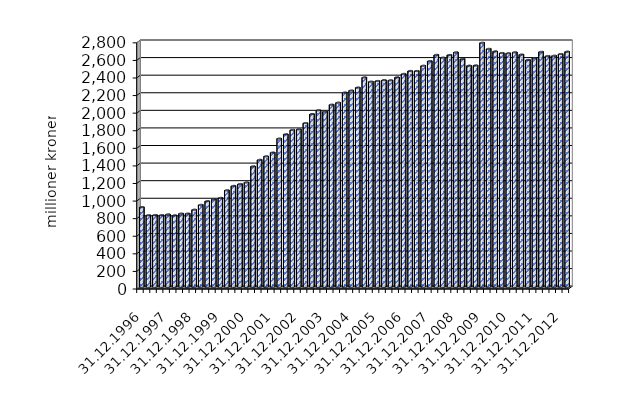
| Category | Series 0 |
|---|---|
| 31.12.1996 | 908.416 |
| 31.03.1997 | 816.888 |
| 30.06.1997 | 819.107 |
| 30.09.1997 | 817.552 |
| 31.12.1997 | 825.968 |
| 31.03.1998 | 814.897 |
| 30.06.1998 | 835.22 |
| 30.09.1998 | 835.281 |
| 31.12.1998 | 879.596 |
| 31.03.1999 | 934.62 |
| 30.06.1999 | 976.412 |
| 30.09.1999 | 997.754 |
| 31.12.1999 | 1013.598 |
| 31.03.2000 | 1100.701 |
| 30.06.2000 | 1150.3 |
| 30.09.2000 | 1172.025 |
| 31.12.2000 | 1189.651 |
| 31.03.2001 | 1372.393 |
| 30.06.2001 | 1446.885 |
| 30.09.2001 | 1486.566 |
| 31.12.2001 | 1529.197 |
| 31.03.2002 | 1688.425 |
| 30.06.2002 | 1737.205 |
| 30.09.2002 | 1786.525 |
| 31.12.2002 | 1793.289 |
| 31.03.2003 | 1864.766 |
| 30.06.2003 | 1967.535 |
| 30.09.2003 | 2010.838 |
| 31.12.2003 | 1995.419 |
| 31.03.2004 | 2074.018 |
| 30.06.2004 | 2097.095 |
| 30.09.2004 | 2212.138 |
| 31.12.2004 | 2235.082 |
| 31.03.2005 | 2268.67 |
| 30.06.2005 | 2384.125 |
| 30.09.2005 | 2335.849 |
| 31.12.2005 | 2343.776 |
| 31.03.2006 | 2353.286 |
| 30.06.2006 | 2351.281 |
| 30.09.2006 | 2384.618 |
| 31.12.2006 | 2424.277 |
| 31.03.2007 | 2457.666 |
| 30.06.2007 | 2457.37 |
| 30.09.2007 | 2517.064 |
| 31.12.2007 | 2569.962 |
| 31.03.2008 | 2640.759 |
| 30.06.2008 | 2609.016 |
| 30.09.2008 | 2639.404 |
| 31.12.2008 | 2669.518 |
| 31.03.2009 | 2594.419 |
| 30.06.2009 | 2517.3 |
| 30.09.2009 | 2520.265 |
| 31.12.2009 | 2778.162 |
| 31.03.2010 | 2708.956 |
| 30.06.2010 | 2680.032 |
| 30.09.2010 | 2661.718 |
| 31.12.2010 | 2658.994 |
| 31.03.2011 | 2670.097 |
| 30.06.2011 | 2643.777 |
| 30.09.2011 | 2582.864 |
| 31.12.2011 | 2603.653 |
| 31.03.2012 | 2674.662 |
| 30.06.2012 | 2627.864 |
| 30.09.2012 | 2630.833 |
| 31.12.2012 | 2649.814 |
| 31.03.2013 | 2676.984 |